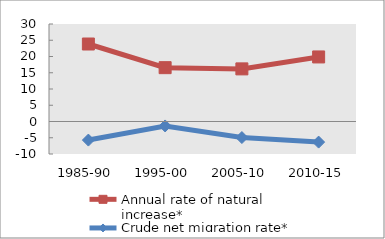
| Category | Annual rate of natural increase* | Crude net migration rate* |
|---|---|---|
| 1985-90 | 23.844 | -5.718 |
| 1995-00 | 16.567 | -1.37 |
| 2005-10 | 16.188 | -4.939 |
| 2010-15 | 19.863 | -6.34 |